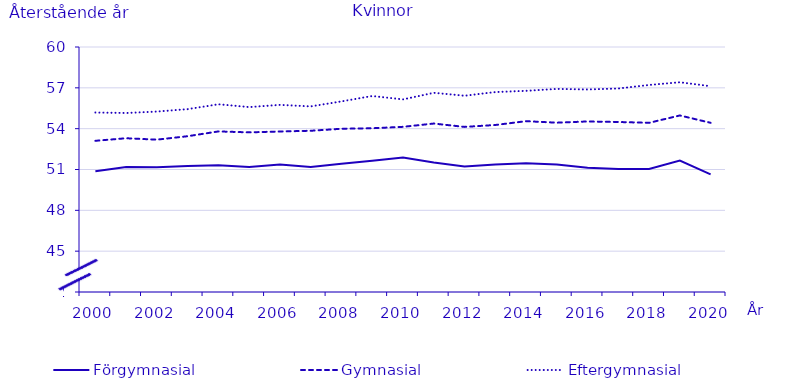
| Category | Förgymnasial | Gymnasial | Eftergymnasial |
|---|---|---|---|
| 2000.0 | 50.875 | 53.108 | 55.187 |
| 2001.0 | 51.177 | 53.296 | 55.151 |
| 2002.0 | 51.161 | 53.193 | 55.256 |
| 2003.0 | 51.259 | 53.446 | 55.434 |
| 2004.0 | 51.313 | 53.797 | 55.792 |
| 2005.0 | 51.176 | 53.728 | 55.586 |
| 2006.0 | 51.361 | 53.793 | 55.749 |
| 2007.0 | 51.188 | 53.845 | 55.637 |
| 2008.0 | 51.414 | 53.993 | 56.003 |
| 2009.0 | 51.651 | 54.031 | 56.399 |
| 2010.0 | 51.886 | 54.134 | 56.151 |
| 2011.0 | 51.511 | 54.375 | 56.635 |
| 2012.0 | 51.22 | 54.13 | 56.42 |
| 2013.0 | 51.37 | 54.27 | 56.69 |
| 2014.0 | 51.45 | 54.55 | 56.78 |
| 2015.0 | 51.36 | 54.44 | 56.92 |
| 2016.0 | 51.12 | 54.53 | 56.88 |
| 2017.0 | 51.03 | 54.49 | 56.95 |
| 2018.0 | 51.04 | 54.43 | 57.21 |
| 2019.0 | 51.66 | 54.97 | 57.41 |
| 2020.0 | 50.64 | 54.43 | 57.12 |